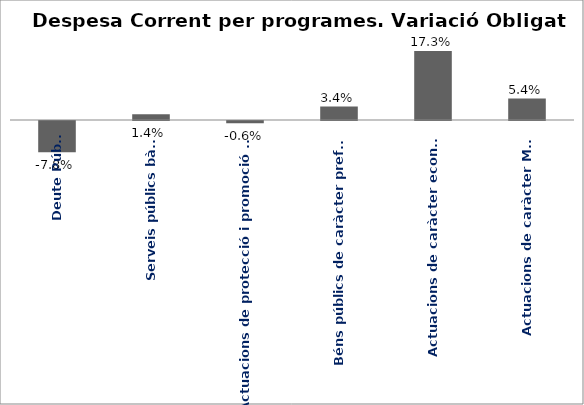
| Category | Series 0 |
|---|---|
| Deute Públic | -0.078 |
| Serveis públics bàsics | 0.014 |
| Actuacions de protecció i promoció social | -0.006 |
| Béns públics de caràcter preferent | 0.034 |
| Actuacions de caràcter econòmic | 0.173 |
| Actuacions de caràcter Marçal | 0.054 |